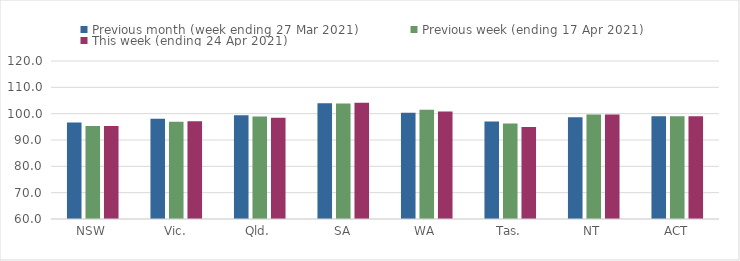
| Category | Previous month (week ending 27 Mar 2021) | Previous week (ending 17 Apr 2021) | This week (ending 24 Apr 2021) |
|---|---|---|---|
| NSW | 96.61 | 95.31 | 95.28 |
| Vic. | 98.09 | 96.97 | 97.09 |
| Qld. | 99.44 | 98.97 | 98.46 |
| SA | 103.97 | 103.84 | 104.14 |
| WA | 100.37 | 101.46 | 100.79 |
| Tas. | 97.06 | 96.3 | 94.96 |
| NT | 98.65 | 99.67 | 99.67 |
| ACT | 99.05 | 99.05 | 99.05 |